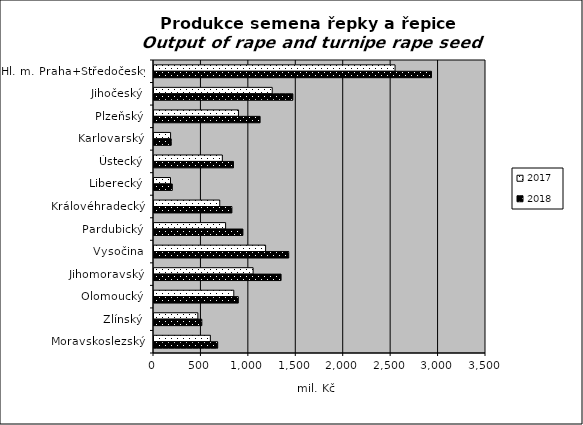
| Category | 2017 | 2018 |
|---|---|---|
| Hl. m. Praha+Středočeský | 2541.324 | 2925.11 |
| Jihočeský | 1246.276 | 1464.009 |
| Plzeňský | 890.449 | 1118.535 |
| Karlovarský | 174.908 | 181.529 |
| Ústecký | 720.459 | 837.825 |
| Liberecký | 174.018 | 192.68 |
| Královéhradecký | 693.082 | 821.233 |
| Pardubický | 755.017 | 937.397 |
| Vysočina | 1176.579 | 1420.556 |
| Jihomoravský | 1044.892 | 1339.677 |
| Olomoucký | 841.192 | 888.554 |
| Zlínský | 462.305 | 504.315 |
| Moravskoslezský | 594.294 | 671.47 |